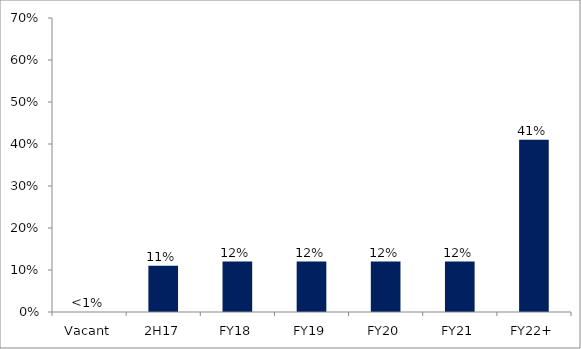
| Category | Series 0 |
|---|---|
| Vacant | 0 |
| 2H17 | 0.11 |
| FY18 | 0.12 |
| FY19 | 0.12 |
| FY20 | 0.12 |
| FY21 | 0.12 |
| FY22+ | 0.41 |